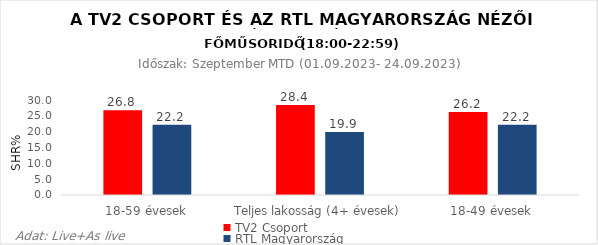
| Category | TV2 Csoport | RTL Magyarország |
|---|---|---|
| 18-59 évesek | 26.8 | 22.2 |
| Teljes lakosság (4+ évesek) | 28.4 | 19.9 |
| 18-49 évesek | 26.2 | 22.2 |